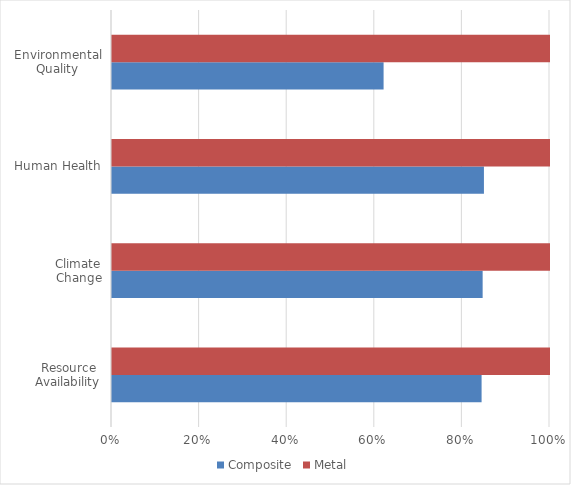
| Category | Composite | Metal |
|---|---|---|
| Resource Availability | 0.844 | 1 |
| Climate Change | 0.846 | 1 |
| Human Health | 0.849 | 1 |
| Environmental Quality | 0.62 | 1 |